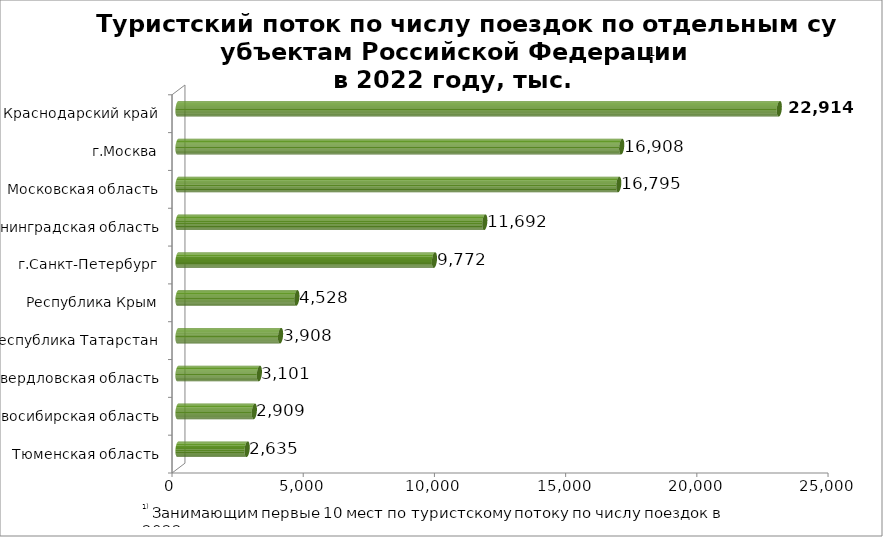
| Category | Series 0 |
|---|---|
| Тюменская область | 2635.357 |
| Новосибирская область | 2909.307 |
| Свердловская область | 3100.631 |
| Республика Татарстан | 3908.17 |
| Республика Крым | 4528.063 |
| г.Санкт-Петербург | 9772.334 |
| Ленинградская область | 11691.683 |
| Московская область | 16795.275 |
| г.Москва | 16908.169 |
| Краснодарский край | 22914.287 |